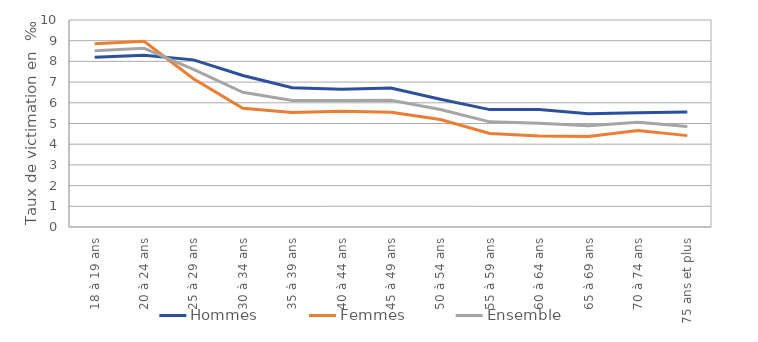
| Category | Hommes | Femmes | Ensemble |
|---|---|---|---|
| 18 à 19 ans | 8.2 | 8.851 | 8.516 |
| 20 à 24 ans | 8.302 | 8.974 | 8.632 |
| 25 à 29 ans | 8.074 | 7.162 | 7.614 |
| 30 à 34 ans | 7.317 | 5.736 | 6.508 |
| 35 à 39 ans | 6.731 | 5.527 | 6.113 |
| 40 à 44 ans | 6.66 | 5.589 | 6.116 |
| 45 à 49 ans | 6.717 | 5.538 | 6.122 |
| 50 à 54 ans | 6.173 | 5.193 | 5.675 |
| 55 à 59 ans | 5.671 | 4.517 | 5.079 |
| 60 à 64 ans | 5.68 | 4.402 | 5.012 |
| 65 à 69 ans | 5.475 | 4.369 | 4.887 |
| 70 à 74 ans | 5.518 | 4.667 | 5.06 |
| 75 ans et plus | 5.557 | 4.414 | 4.86 |